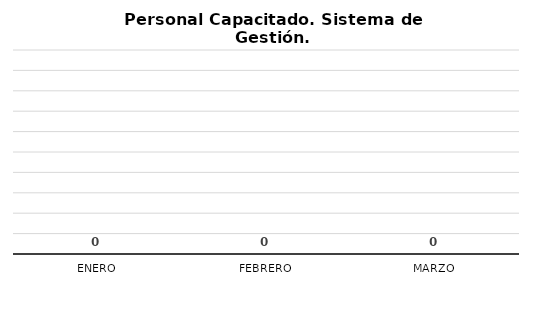
| Category | Personal capacitado/2 |
|---|---|
| Enero | 0 |
| Febrero | 0 |
| Marzo | 0 |